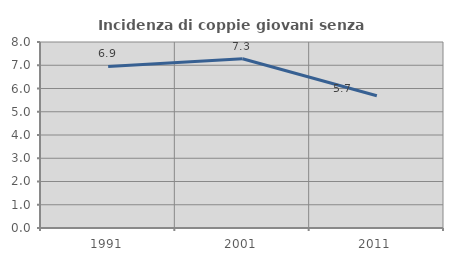
| Category | Incidenza di coppie giovani senza figli |
|---|---|
| 1991.0 | 6.947 |
| 2001.0 | 7.278 |
| 2011.0 | 5.686 |